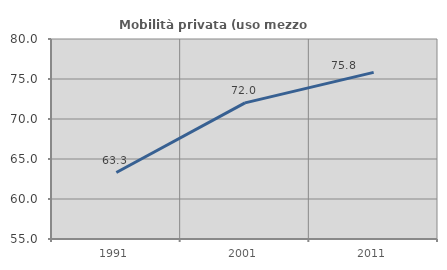
| Category | Mobilità privata (uso mezzo privato) |
|---|---|
| 1991.0 | 63.306 |
| 2001.0 | 72.016 |
| 2011.0 | 75.823 |